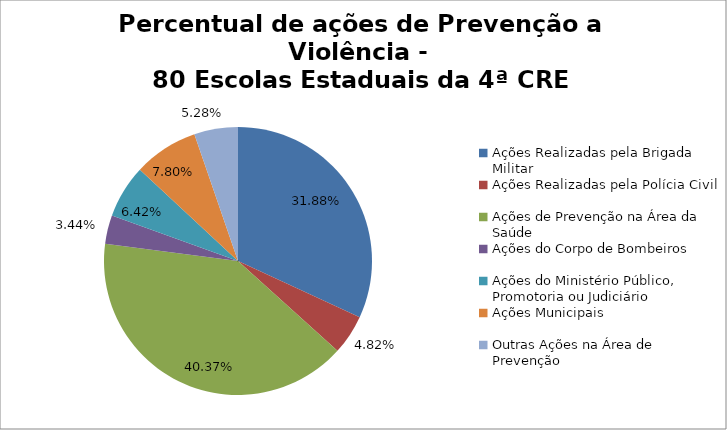
| Category | Percentual |
|---|---|
| Ações Realizadas pela Brigada Militar | 0.319 |
| Ações Realizadas pela Polícia Civil | 0.048 |
| Ações de Prevenção na Área da Saúde | 0.404 |
| Ações do Corpo de Bombeiros | 0.034 |
| Ações do Ministério Público, Promotoria ou Judiciário | 0.064 |
| Ações Municipais | 0.078 |
| Outras Ações na Área de Prevenção | 0.053 |